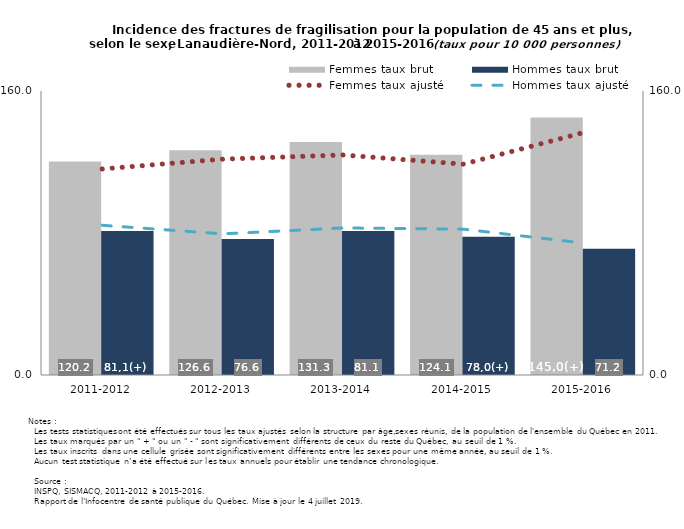
| Category | Femmes taux brut | Hommes taux brut |
|---|---|---|
| 2011-2012 | 120.237 | 81.108 |
| 2012-2013 | 126.606 | 76.647 |
| 2013-2014 | 131.32 | 81.107 |
| 2014-2015 | 124.051 | 77.956 |
| 2015-2016 | 145.02 | 71.171 |